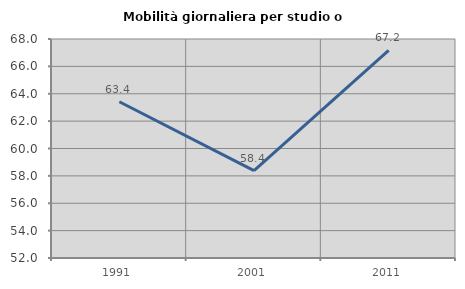
| Category | Mobilità giornaliera per studio o lavoro |
|---|---|
| 1991.0 | 63.415 |
| 2001.0 | 58.389 |
| 2011.0 | 67.172 |